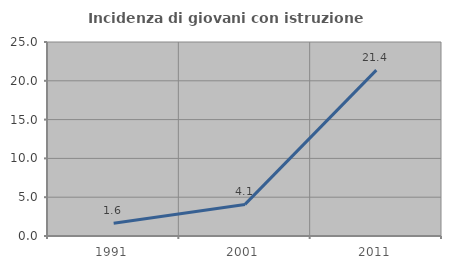
| Category | Incidenza di giovani con istruzione universitaria |
|---|---|
| 1991.0 | 1.639 |
| 2001.0 | 4.072 |
| 2011.0 | 21.374 |